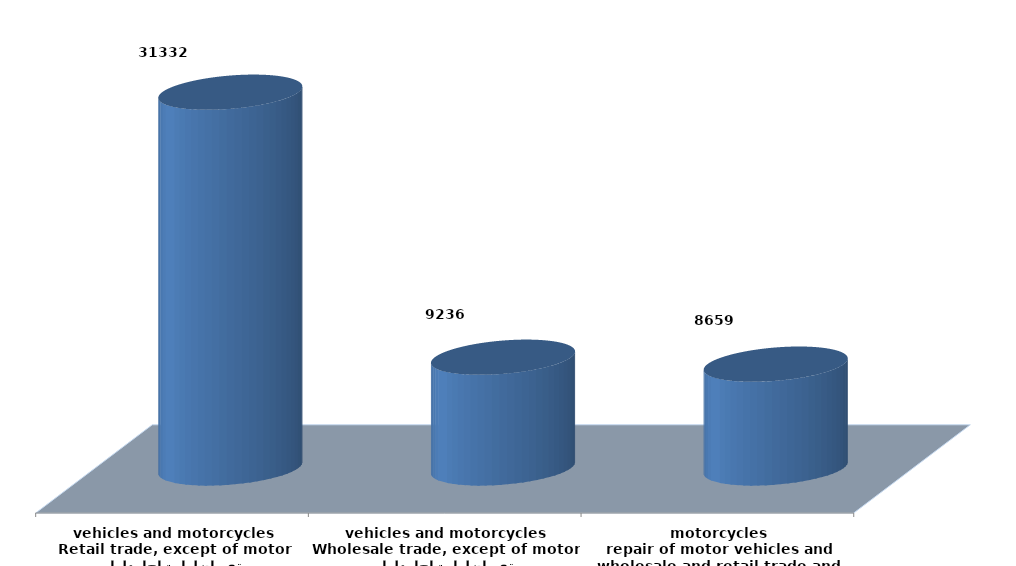
| Category | Series 0 |
|---|---|
| تجارة الجملة والتجزئة ،واصلاح المركبات ذات المحركات والدراجات النارية
wholesale and retail trade and repair of motor vehicles and motorcycles | 8658879 |
| تجارة الجملة ، باستثناء المركبات ذات المحركات والدراجات النارية
Wholesale trade, except of motor vehicles and motorcycles | 9236370 |
| تجارة التجزئة،باستثناء المركبات ذات المحركات والدراجات النارية
Retail trade, except of motor vehicles and motorcycles | 31332123 |